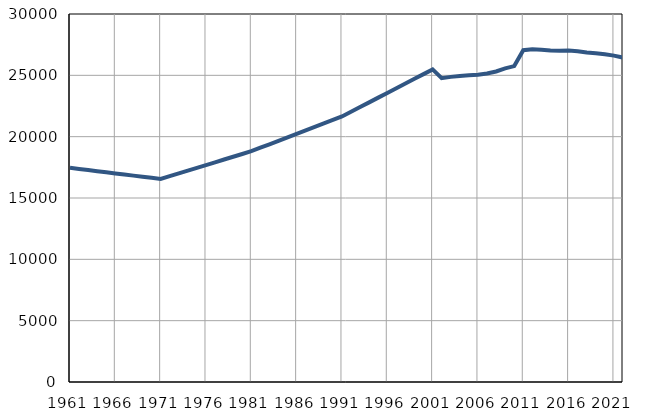
| Category | Број
становника |
|---|---|
| 1961.0 | 17461 |
| 1962.0 | 17370 |
| 1963.0 | 17279 |
| 1964.0 | 17188 |
| 1965.0 | 17097 |
| 1966.0 | 17006 |
| 1967.0 | 16916 |
| 1968.0 | 16825 |
| 1969.0 | 16734 |
| 1970.0 | 16643 |
| 1971.0 | 16552 |
| 1972.0 | 16778 |
| 1973.0 | 17005 |
| 1974.0 | 17231 |
| 1975.0 | 17457 |
| 1976.0 | 17684 |
| 1977.0 | 17910 |
| 1978.0 | 18136 |
| 1979.0 | 18362 |
| 1980.0 | 18588 |
| 1981.0 | 18815 |
| 1982.0 | 19098 |
| 1983.0 | 19381 |
| 1984.0 | 19665 |
| 1985.0 | 19948 |
| 1986.0 | 20231 |
| 1987.0 | 20514 |
| 1988.0 | 20797 |
| 1989.0 | 21081 |
| 1990.0 | 21364 |
| 1991.0 | 21647 |
| 1992.0 | 22030 |
| 1993.0 | 22414 |
| 1994.0 | 22797 |
| 1995.0 | 23181 |
| 1996.0 | 23564 |
| 1997.0 | 23948 |
| 1998.0 | 24331 |
| 1999.0 | 24715 |
| 2000.0 | 25098 |
| 2001.0 | 25482 |
| 2002.0 | 24768 |
| 2003.0 | 24874 |
| 2004.0 | 24948 |
| 2005.0 | 25000 |
| 2006.0 | 25053 |
| 2007.0 | 25146 |
| 2008.0 | 25315 |
| 2009.0 | 25563 |
| 2010.0 | 25753 |
| 2011.0 | 27048 |
| 2012.0 | 27125 |
| 2013.0 | 27084 |
| 2014.0 | 27031 |
| 2015.0 | 27013 |
| 2016.0 | 27024 |
| 2017.0 | 26964 |
| 2018.0 | 26855 |
| 2019.0 | 26798 |
| 2020.0 | 26716 |
| 2021.0 | 26608 |
| 2022.0 | 26449 |